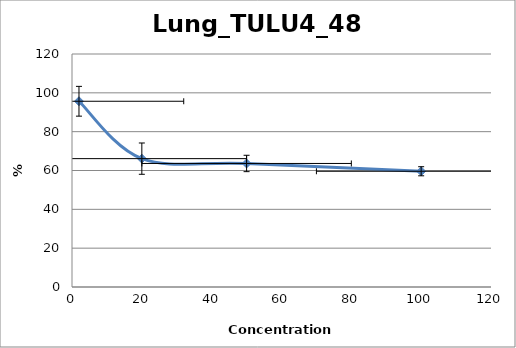
| Category | Lung-tulu4 |
|---|---|
| 100.0 | 59.611 |
| 50.0 | 63.626 |
| 20.0 | 66.109 |
| 2.0 | 95.662 |
| nan | 0 |
| nan | 0 |
| nan | 0 |
| nan | 0 |
| nan | 0 |